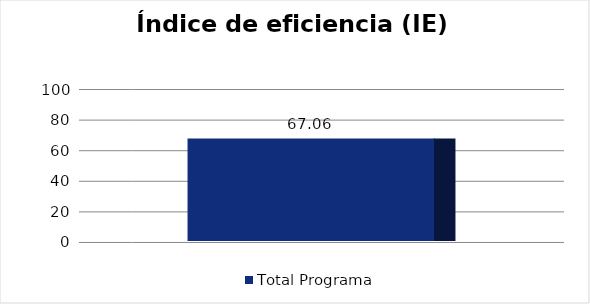
| Category | Total Programa |
|---|---|
| Índice de eficiencia (IE)  | 67.056 |